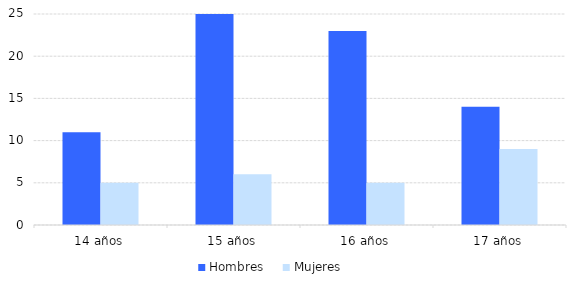
| Category | Hombres | Mujeres |
|---|---|---|
| 14 años | 11 | 5 |
| 15 años | 28 | 6 |
| 16 años | 23 | 5 |
| 17 años | 14 | 9 |